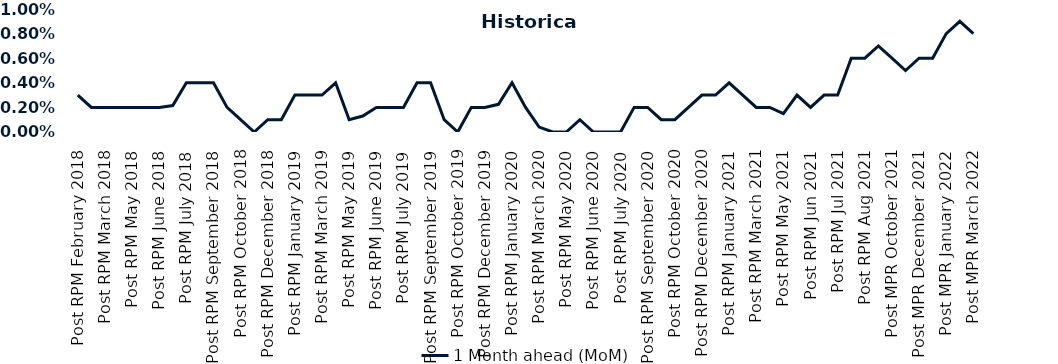
| Category | 1 Month ahead (MoM) |
|---|---|
| Post RPM February 2018 | 0.003 |
| Pre RPM March 2018 | 0.002 |
| Post RPM March 2018 | 0.002 |
| Pre RPM May 2018 | 0.002 |
| Post RPM May 2018 | 0.002 |
| Pre RPM June 2018 | 0.002 |
| Post RPM June 2018 | 0.002 |
| Pre RPM July 2018 | 0.002 |
| Post RPM July 2018 | 0.004 |
| Pre RPM September 2018 | 0.004 |
| Post RPM September 2018 | 0.004 |
| Pre RPM October 2018 | 0.002 |
| Post RPM October 2018 | 0.001 |
| Pre RPM December 2018 | 0 |
| Post RPM December 2018 | 0.001 |
| Pre RPM January 2019 | 0.001 |
| Post RPM January 2019 | 0.003 |
| Pre RPM March 2019 | 0.003 |
| Post RPM March 2019 | 0.003 |
| Pre RPM May 2019 | 0.004 |
| Post RPM May 2019 | 0.001 |
| Pre RPM June 2019 | 0.001 |
| Post RPM June 2019 | 0.002 |
| Pre RPM July 2019 | 0.002 |
| Post RPM July 2019 | 0.002 |
| Pre RPM September 2019 | 0.004 |
| Post RPM September 2019 | 0.004 |
| Pre RPM October 2019 | 0.001 |
| Post RPM October 2019 | 0 |
| Pre RPM December 2019 | 0.002 |
| Post RPM December 2019 | 0.002 |
| Pre RPM January 2020 | 0.002 |
| Post RPM January 2020 | 0.004 |
| Pre RPM March 2020 | 0.002 |
| Post RPM March 2020 | 0 |
| Pre RPM May 2020 | 0 |
| Post RPM May 2020 | 0 |
| Pre RPM June 2020 | 0.001 |
| Post RPM June 2020 | 0 |
| Pre RPM July 2020 | 0 |
| Post RPM July 2020 | 0 |
| Pre RPM September 2020 | 0.002 |
| Post RPM September 2020 | 0.002 |
| Pre RPM October 2020 | 0.001 |
| Post RPM October 2020 | 0.001 |
| Pre RPM December 2020 | 0.002 |
|  Post RPM December 2020 | 0.003 |
| Pre RPM January 2021 | 0.003 |
| Post RPM January 2021 | 0.004 |
|  Pre RPM March 2021 | 0.003 |
|  Post RPM March 2021 | 0.002 |
|  Pre RPM May 2021 | 0.002 |
|  Post RPM May 2021 | 0.002 |
|  Pre RPM Jun 2021 | 0.003 |
|   Post RPM Jun 2021 | 0.002 |
| Pre RPM Jul 2021 | 0.003 |
|  Post RPM Jul 2021 | 0.003 |
| Pre RPM Aug 2021 | 0.006 |
|  Post RPM Aug 2021 | 0.006 |
| Pre MPR October 2021 | 0.007 |
| Post MPR October 2021 | 0.006 |
| Pre MPR December 2021 | 0.005 |
| Post MPR December 2021 | 0.006 |
| Pre MPR January 2022 | 0.006 |
| Post MPR January 2022 | 0.008 |
| Pre MPR March 2022 | 0.009 |
| Post MPR March 2022 | 0.008 |